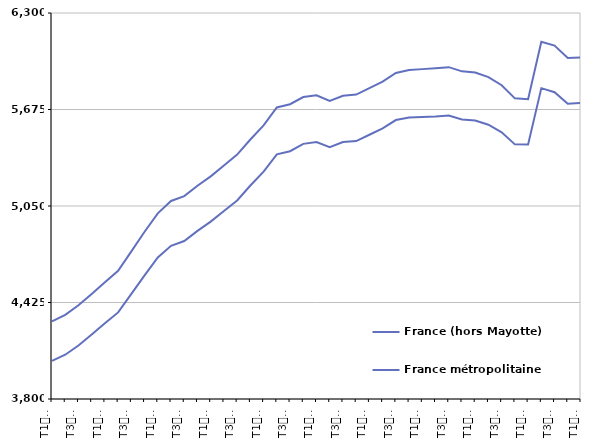
| Category | France (hors Mayotte) | France métropolitaine |
|---|---|---|
| T1
2011 | 4302.9 | 4047.5 |
| T2
2011 | 4345.1 | 4086.7 |
| T3
2011 | 4407 | 4146.5 |
| T4
2011 | 4480.5 | 4217.6 |
| T1
2012 | 4556.5 | 4290.3 |
| T2
2012 | 4630.7 | 4360.7 |
| T3
2012 | 4756.3 | 4480.8 |
| T4
2012 | 4883 | 4600.9 |
| T1
2013 | 5002.2 | 4716.3 |
| T2
2013 | 5082.7 | 4791.9 |
| T3
2013 | 5114 | 4822.9 |
| T4
2013 | 5181.5 | 4888.7 |
| T1
2014 | 5242 | 4948.8 |
| T2
2014 | 5312.3 | 5017.1 |
| T3
2014 | 5382.6 | 5085.7 |
| T4
2014 | 5480.7 | 5182.8 |
| T1
2015 | 5571.7 | 5272.2 |
| T2
2015 | 5688.4 | 5384.8 |
| T3
2015 | 5709 | 5404.8 |
| T4
2015 | 5755.8 | 5452.5 |
| T1
2016 | 5767.1 | 5464 |
| T2
2016 | 5730 | 5430.7 |
| T3
2016 | 5764.3 | 5464.3 |
| T4
2016 | 5771.7 | 5470.4 |
| T1
2017 | 5813.4 | 5511.3 |
| T2
2017 | 5855.1 | 5552.5 |
| T3
2017 | 5911.8 | 5606.6 |
| T4
2017 | 5931 | 5622.8 |
| T1
2018 | 5936.5 | 5626.6 |
| T2
2018 | 5942.3 | 5629.4 |
| T3
2018 | 5949.2 | 5636.1 |
| T4
2018 | 5922.2 | 5610.7 |
| T1
2019 | 5914.3 | 5603.1 |
| T2
2019 | 5884.6 | 5576.3 |
| T3
2019 | 5832.2 | 5527.4 |
| T4
2019 | 5747.1 | 5449.2 |
| T1
2020 | 5742 | 5448.2 |
| T2
2020 | 6113.9 | 5813.3 |
| T3
2020 | 6089.3 | 5787.1 |
| T4
2020 | 6008.4 | 5712.2 |
| T1
2021 | 6012.6 | 5716.9 |